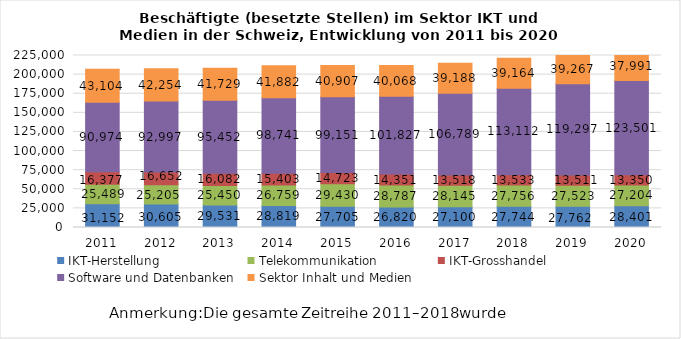
| Category | IKT-Herstellung | Telekommunikation | IKT-Grosshandel | Software und Datenbanken | Sektor Inhalt und Medien |
|---|---|---|---|---|---|
| 2011.0 | 31152 | 25489 | 16377 | 90974 | 43104 |
| 2012.0 | 30605 | 25205 | 16652 | 92997 | 42254 |
| 2013.0 | 29531 | 25450 | 16082 | 95452 | 41729 |
| 2014.0 | 28819 | 26759 | 15403 | 98741 | 41882 |
| 2015.0 | 27705 | 29430 | 14723 | 99151 | 40907 |
| 2016.0 | 26820 | 28787 | 14351 | 101827 | 40068 |
| 2017.0 | 27100 | 28145 | 13518 | 106789 | 39188 |
| 2018.0 | 27744 | 27756 | 13533 | 113112 | 39164 |
| 2019.0 | 27762 | 27523 | 13511 | 119297 | 39267 |
| 2020.0 | 28401 | 27204 | 13350 | 123501 | 37991 |